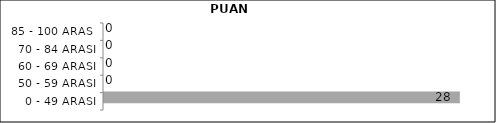
| Category | Series 0 | Series 1 | Series 2 |
|---|---|---|---|
| 0 - 49 ARASI |  |  | 28 |
| 50 - 59 ARASI |  |  | 0 |
| 60 - 69 ARASI |  |  | 0 |
| 70 - 84 ARASI |  |  | 0 |
| 85 - 100 ARASI |  |  | 0 |